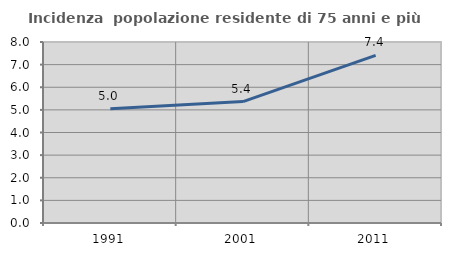
| Category | Incidenza  popolazione residente di 75 anni e più |
|---|---|
| 1991.0 | 5.049 |
| 2001.0 | 5.367 |
| 2011.0 | 7.407 |